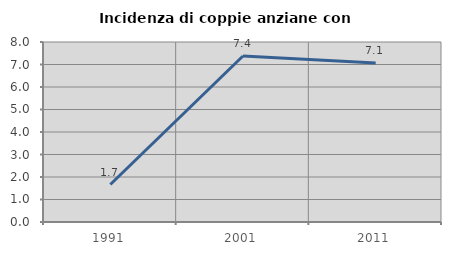
| Category | Incidenza di coppie anziane con figli |
|---|---|
| 1991.0 | 1.667 |
| 2001.0 | 7.377 |
| 2011.0 | 7.071 |